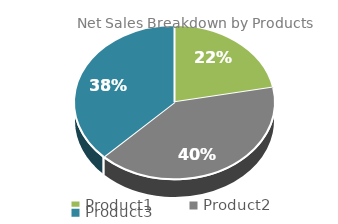
| Category | NetSales |
|---|---|
| Product1 | 18110 |
| Product2 | 33358 |
| Product3 | 30951 |